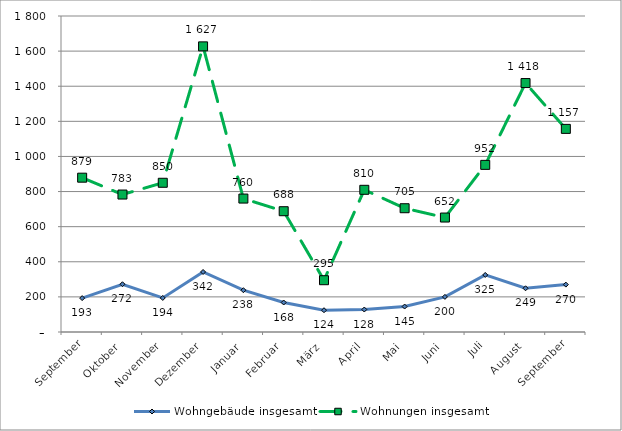
| Category | Wohngebäude insgesamt | Wohnungen insgesamt |
|---|---|---|
| September | 193 | 879 |
| Oktober | 272 | 783 |
| November | 194 | 850 |
| Dezember | 342 | 1627 |
| Januar | 238 | 760 |
| Februar | 168 | 688 |
| März | 124 | 295 |
| April | 128 | 810 |
| Mai | 145 | 705 |
| Juni | 200 | 652 |
| Juli | 325 | 952 |
| August | 249 | 1418 |
| September | 270 | 1157 |